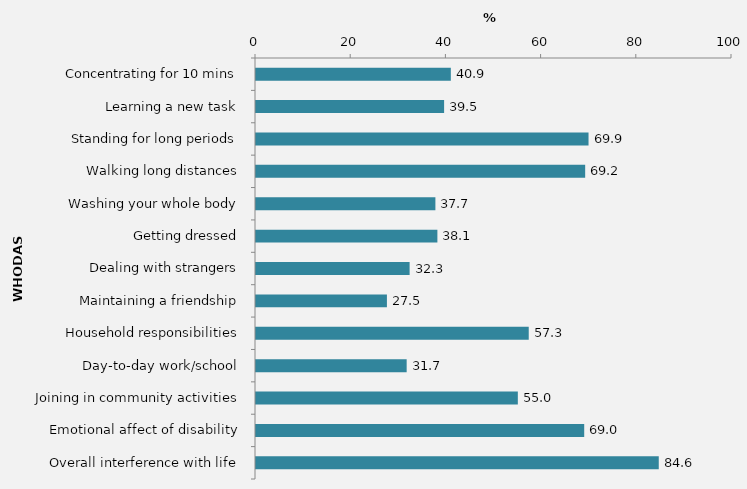
| Category | Series 0 |
|---|---|
| Concentrating for 10 mins | 40.931 |
| Learning a new task | 39.519 |
| Standing for long periods | 69.86 |
| Walking long distances | 69.154 |
| Washing your whole body | 37.689 |
| Getting dressed | 38.107 |
| Dealing with strangers | 32.272 |
| Maintaining a friendship | 27.503 |
| Household responsibilities | 57.297 |
| Day-to-day work/school | 31.652 |
| Joining in community activities | 55.006 |
| Emotional affect of disability | 68.953 |
| Overall interference with life | 84.613 |